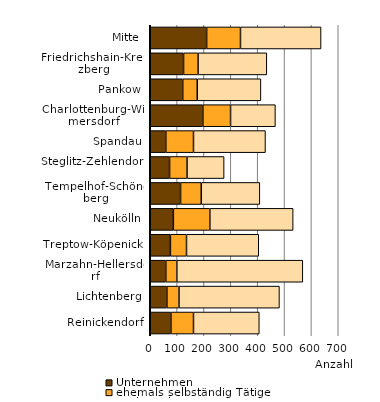
| Category | Unternehmen | ehemals selbständig Tätige | Verbraucher |
|---|---|---|---|
| Reinickendorf | 77 | 84 | 245 |
| Lichtenberg | 62 | 45 | 374 |
| Marzahn-Hellersdorf | 58 | 41 | 469 |
| Treptow-Köpenick | 75 | 60 | 269 |
| Neukölln | 86 | 136 | 310 |
| Tempelhof-Schöneberg | 113 | 77 | 218 |
| Steglitz-Zehlendorf | 72 | 65 | 138 |
| Spandau | 58 | 103 | 268 |
| Charlottenburg-Wilmersdorf | 196 | 103 | 167 |
| Pankow | 121 | 54 | 237 |
| Friedrichshain-Kreuzberg | 124 | 54 | 256 |
| Mitte | 210 | 126 | 300 |